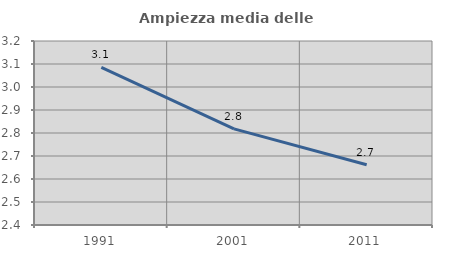
| Category | Ampiezza media delle famiglie |
|---|---|
| 1991.0 | 3.085 |
| 2001.0 | 2.818 |
| 2011.0 | 2.662 |